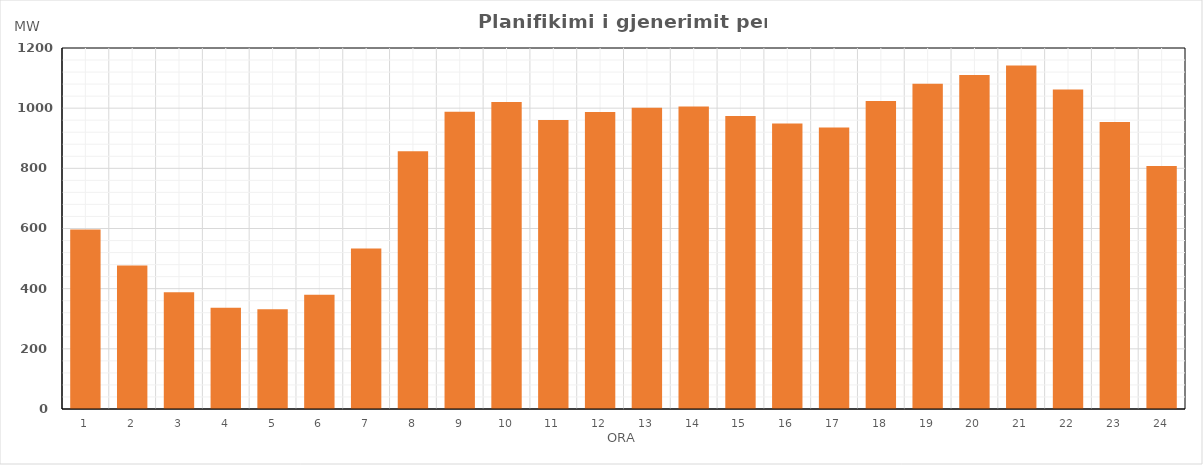
| Category | Max (MW) |
|---|---|
| 0 | 596.4 |
| 1 | 477.4 |
| 2 | 388.065 |
| 3 | 336.663 |
| 4 | 331.702 |
| 5 | 379.925 |
| 6 | 533.4 |
| 7 | 856.4 |
| 8 | 988.4 |
| 9 | 1020.689 |
| 10 | 960.911 |
| 11 | 987.008 |
| 12 | 1001.173 |
| 13 | 1005.181 |
| 14 | 973.989 |
| 15 | 948.761 |
| 16 | 935.723 |
| 17 | 1023.731 |
| 18 | 1080.953 |
| 19 | 1110.124 |
| 20 | 1141.414 |
| 21 | 1061.815 |
| 22 | 954.026 |
| 23 | 808.124 |